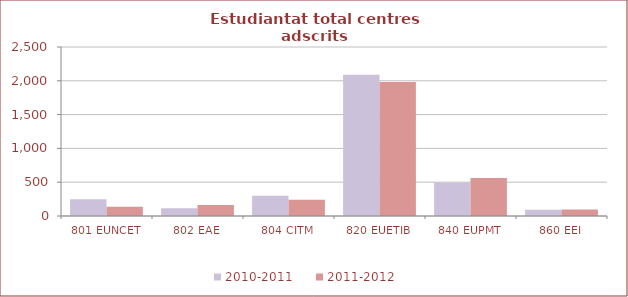
| Category | 2010-2011 | 2011-2012 |
|---|---|---|
| 801 EUNCET | 247 | 137 |
| 802 EAE | 114 | 163 |
| 804 CITM | 298 | 240 |
| 820 EUETIB | 2088 | 1984 |
| 840 EUPMT | 496 | 561 |
| 860 EEI | 92 | 98 |